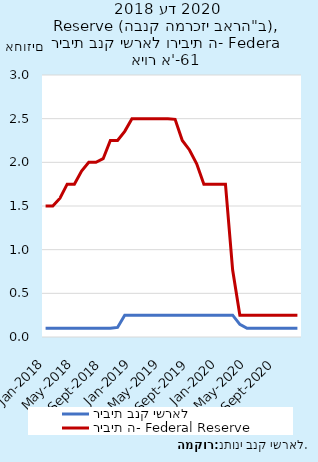
| Category | ריבית בנק ישראל | ריבית ה- Federal Reserve |
|---|---|---|
| 2018-01-31 | 0.1 | 1.5 |
| 2018-02-28 | 0.1 | 1.5 |
| 2018-03-31 | 0.1 | 1.589 |
| 2018-04-30 | 0.1 | 1.75 |
| 2018-05-31 | 0.1 | 1.75 |
| 2018-06-30 | 0.1 | 1.9 |
| 2018-07-31 | 0.1 | 2 |
| 2018-08-31 | 0.1 | 2 |
| 2018-09-30 | 0.1 | 2.042 |
| 2018-10-31 | 0.1 | 2.25 |
| 2018-11-30 | 0.11 | 2.25 |
| 2018-12-31 | 0.25 | 2.355 |
| 2019-01-31 | 0.25 | 2.5 |
| 2019-02-28 | 0.25 | 2.5 |
| 2019-03-31 | 0.25 | 2.5 |
| 2019-04-30 | 0.25 | 2.5 |
| 2019-05-31 | 0.25 | 2.5 |
| 2019-06-30 | 0.25 | 2.5 |
| 2019-07-31 | 0.25 | 2.492 |
| 2019-08-31 | 0.25 | 2.25 |
| 2019-09-30 | 0.25 | 2.142 |
| 2019-10-31 | 0.25 | 1.984 |
| 2019-11-30 | 0.25 | 1.75 |
| 2019-12-31 | 0.25 | 1.75 |
| 2020-01-31 | 0.25 | 1.75 |
| 2020-02-29 | 0.25 | 1.75 |
| 2020-03-31 | 0.25 | 0.766 |
| 2020-04-30 | 0.145 | 0.25 |
| 2020-05-31 | 0.1 | 0.25 |
| 2020-06-30 | 0.1 | 0.25 |
| 2020-07-31 | 0.1 | 0.25 |
| 2020-08-31 | 0.1 | 0.25 |
| 2020-09-30 | 0.1 | 0.25 |
| 2020-10-31 | 0.1 | 0.25 |
| 2020-11-30 | 0.1 | 0.25 |
| 2020-12-31 | 0.1 | 0.25 |